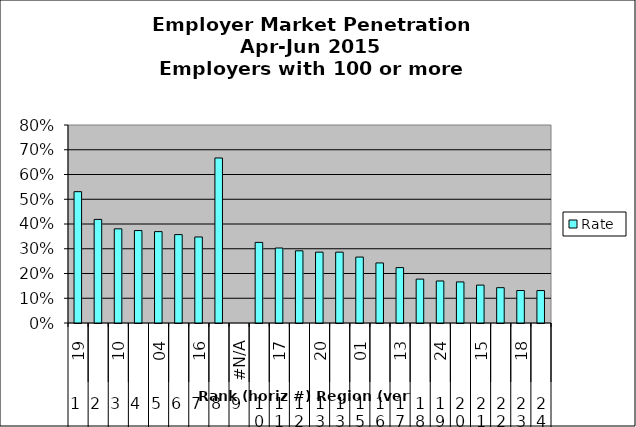
| Category | Rate |
|---|---|
| 0 | 0.531 |
| 1 | 0.419 |
| 2 | 0.38 |
| 3 | 0.373 |
| 4 | 0.369 |
| 5 | 0.357 |
| 6 | 0.348 |
| 7 | 0.667 |
| 8 | 0 |
| 9 | 0.326 |
| 10 | 0.303 |
| 11 | 0.292 |
| 12 | 0.286 |
| 13 | 0.286 |
| 14 | 0.266 |
| 15 | 0.243 |
| 16 | 0.224 |
| 17 | 0.177 |
| 18 | 0.17 |
| 19 | 0.166 |
| 20 | 0.153 |
| 21 | 0.143 |
| 22 | 0.131 |
| 23 | 0.131 |